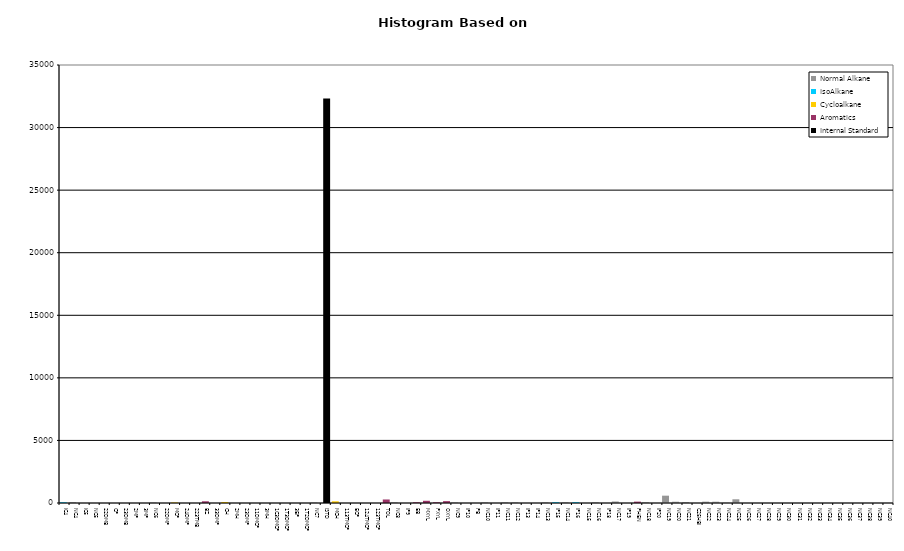
| Category | Normal Alkane | IsoAlkane | Cycloalkane | Aromatics | Internal Standard |
|---|---|---|---|---|---|
| IC4 | 0 | 57 | 0 | 0 | 0 |
| NC4 | 70 | 0 | 0 | 0 | 0 |
| IC5 | 0 | 0 | 0 | 0 | 0 |
| NC5 | 0 | 0 | 0 | 0 | 0 |
| 22DMB | 0 | 0 | 0 | 0 | 0 |
| CP | 0 | 0 | 0 | 0 | 0 |
| 23DMB | 0 | 0 | 0 | 0 | 0 |
| 2MP | 0 | 0 | 0 | 0 | 0 |
| 3MP | 0 | 0 | 0 | 0 | 0 |
| NC6 | 47 | 0 | 0 | 0 | 0 |
| 22DMP | 0 | 0 | 0 | 0 | 0 |
| MCP | 0 | 0 | 42 | 0 | 0 |
| 24DMP | 0 | 0 | 0 | 0 | 0 |
| 223TMB | 0 | 0 | 0 | 0 | 0 |
| BZ | 0 | 0 | 0 | 137 | 0 |
| 33DMP | 0 | 0 | 0 | 0 | 0 |
| CH | 0 | 0 | 80 | 0 | 0 |
| 2MH | 0 | 0 | 0 | 0 | 0 |
| 23DMP | 0 | 0 | 0 | 0 | 0 |
| 11DMCP | 0 | 0 | 0 | 0 | 0 |
| 3MH | 0 | 0 | 0 | 0 | 0 |
| 1C3DMCP | 0 | 0 | 0 | 0 | 0 |
| 1T3DMCP | 0 | 0 | 0 | 0 | 0 |
| 3EP | 0 | 0 | 0 | 0 | 0 |
| 1T2DMCP | 0 | 0 | 0 | 0 | 0 |
| NC7 | 43 | 0 | 0 | 0 | 0 |
| ISTD | 0 | 0 | 0 | 0 | 32320 |
| MCH | 0 | 0 | 136 | 0 | 0 |
| 113TMCP | 0 | 0 | 0 | 0 | 0 |
| ECP | 0 | 0 | 0 | 0 | 0 |
| 124TMCP | 0 | 0 | 0 | 0 | 0 |
| 123TMCP | 0 | 0 | 0 | 0 | 0 |
| TOL | 0 | 0 | 0 | 281 | 0 |
| NC8 | 60 | 0 | 0 | 0 | 0 |
| IP9 | 0 | 0 | 0 | 0 | 0 |
| EB | 0 | 0 | 0 | 58 | 0 |
| MXYL | 0 | 0 | 0 | 177 | 0 |
| PXYL | 0 | 0 | 0 | 60 | 0 |
| OXYL | 0 | 0 | 0 | 150 | 0 |
| NC9 | 47 | 0 | 0 | 0 | 0 |
| IP10 | 0 | 0 | 0 | 0 | 0 |
| PB | 0 | 0 | 0 | 0 | 0 |
| NC10 | 52 | 0 | 0 | 0 | 0 |
| IP11 | 0 | 0 | 0 | 0 | 0 |
| NC11 | 57 | 0 | 0 | 0 | 0 |
| NC12 | 54 | 0 | 0 | 0 | 0 |
| IP13 | 0 | 0 | 0 | 0 | 0 |
| IP14 | 0 | 0 | 0 | 0 | 0 |
| NC13 | 52 | 0 | 0 | 0 | 0 |
| IP15 | 0 | 62 | 0 | 0 | 0 |
| NC14 | 62 | 0 | 0 | 0 | 0 |
| IP16 | 0 | 64 | 0 | 0 | 0 |
| NC15 | 0 | 0 | 0 | 0 | 0 |
| NC16 | 67 | 0 | 0 | 0 | 0 |
| IP18 | 0 | 0 | 0 | 0 | 0 |
| NC17 | 120 | 0 | 0 | 0 | 0 |
| IP19 | 0 | 0 | 0 | 0 | 0 |
| PHEN | 0 | 0 | 0 | 109 | 0 |
| NC18 | 70 | 0 | 0 | 0 | 0 |
| IP20 | 0 | 0 | 0 | 0 | 0 |
| NC19 | 585 | 0 | 0 | 0 | 0 |
| NC20 | 101 | 0 | 0 | 0 | 0 |
| NC21 | 82 | 0 | 0 | 0 | 0 |
| C25HBI | 0 | 0 | 0 | 0 | 0 |
| NC22 | 107 | 0 | 0 | 0 | 0 |
| NC23 | 103 | 0 | 0 | 0 | 0 |
| NC24 | 23 | 0 | 0 | 0 | 0 |
| NC25 | 297 | 0 | 0 | 0 | 0 |
| NC26 | 0 | 0 | 0 | 0 | 0 |
| NC27 | 0 | 0 | 0 | 0 | 0 |
| NC28 | 0 | 0 | 0 | 0 | 0 |
| NC29 | 0 | 0 | 0 | 0 | 0 |
| NC30 | 0 | 0 | 0 | 0 | 0 |
| NC31 | 0 | 0 | 0 | 0 | 0 |
| NC32 | 0 | 0 | 0 | 0 | 0 |
| NC33 | 0 | 0 | 0 | 0 | 0 |
| NC34 | 0 | 0 | 0 | 0 | 0 |
| NC35 | 0 | 0 | 0 | 0 | 0 |
| NC36 | 0 | 0 | 0 | 0 | 0 |
| NC37 | 0 | 0 | 0 | 0 | 0 |
| NC38 | 0 | 0 | 0 | 0 | 0 |
| NC39 | 0 | 0 | 0 | 0 | 0 |
| NC40 | 0 | 0 | 0 | 0 | 0 |